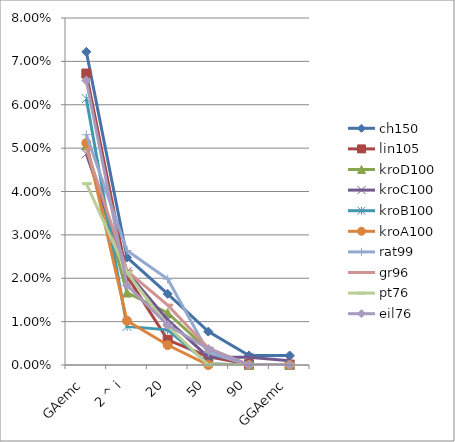
| Category | ch150 | lin105 | kroD100 | kroC100 | kroB100 | kroA100 | rat99 | gr96 | pt76 | eil76 |
|---|---|---|---|---|---|---|---|---|---|---|
| GAemc | 0.072 | 0.067 | 0.051 | 0.049 | 0.061 | 0.051 | 0.053 | 0.05 | 0.042 | 0.066 |
| 2 ^ i | 0.025 | 0.02 | 0.017 | 0.022 | 0.009 | 0.01 | 0.026 | 0.022 | 0.021 | 0.018 |
| 20 | 0.016 | 0.006 | 0.012 | 0.01 | 0.008 | 0.005 | 0.02 | 0.014 | 0.009 | 0.009 |
| 50 | 0.008 | 0.002 | 0.003 | 0.002 | 0 | 0 | 0.003 | 0.004 | 0 | 0.004 |
| 90 | 0.002 | 0 | 0 | 0.002 | 0 | 0 | 0 | 0 | 0 | 0 |
| GGAemc | 0.002 | 0 | 0 | 0.001 | 0 | 0 | 0 | 0 | 0 | 0 |